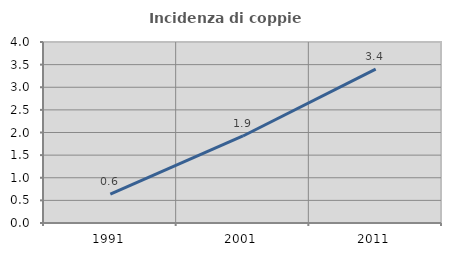
| Category | Incidenza di coppie miste |
|---|---|
| 1991.0 | 0.637 |
| 2001.0 | 1.923 |
| 2011.0 | 3.401 |